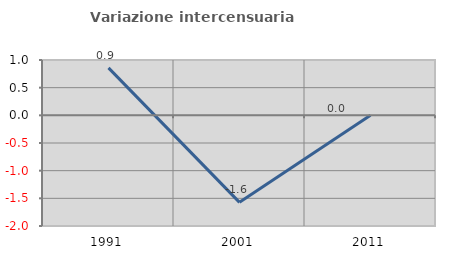
| Category | Variazione intercensuaria annua |
|---|---|
| 1991.0 | 0.858 |
| 2001.0 | -1.572 |
| 2011.0 | 0 |